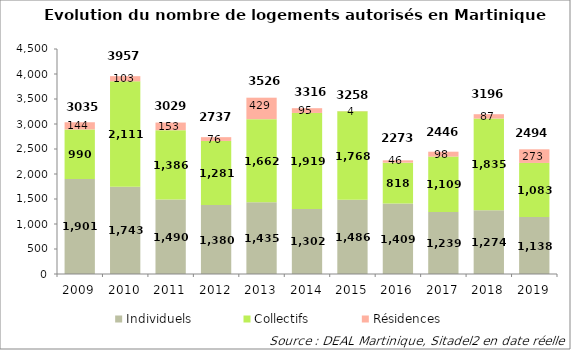
| Category | Individuels | Collectifs | Résidences |
|---|---|---|---|
| 2009 | 1901 | 990 | 144 |
| 2010 | 1743 | 2111 | 103 |
| 2011 | 1490 | 1386 | 153 |
| 2012 | 1380 | 1281 | 76 |
| 2013 | 1435 | 1662 | 429 |
| 2014 | 1302 | 1919 | 95 |
| 2015 | 1486 | 1768 | 4 |
| 2016 | 1409 | 818 | 46 |
| 2017 | 1239 | 1109 | 98 |
| 2018 | 1274 | 1835 | 87 |
| 2019 | 1138 | 1083 | 273 |